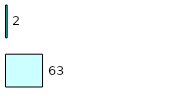
| Category | Series 0 | Series 1 |
|---|---|---|
| 0 | 63 | 2 |